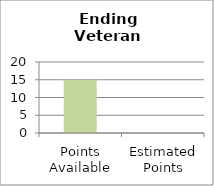
| Category | Ending Veteran Homelessness |
|---|---|
| Points Available | 15 |
| Estimated Points | 0 |